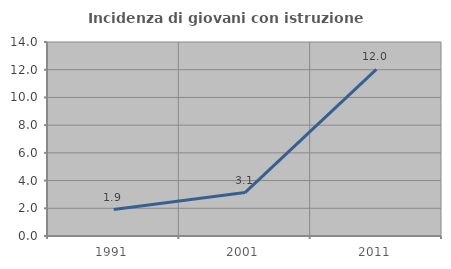
| Category | Incidenza di giovani con istruzione universitaria |
|---|---|
| 1991.0 | 1.911 |
| 2001.0 | 3.134 |
| 2011.0 | 12.03 |